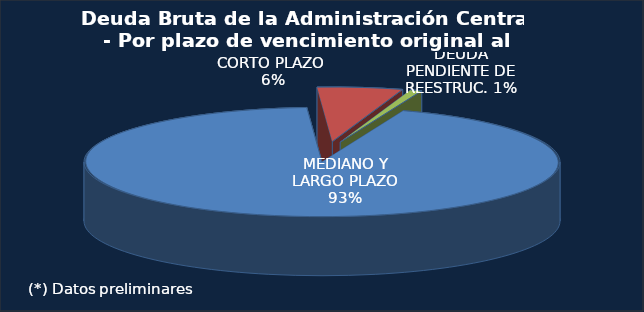
| Category | Series 0 |
|---|---|
| MEDIANO Y LARGO PLAZO | 303042.1 |
| CORTO PLAZO  | 18805.5 |
| DEUDA PENDIENTE DE REESTRUC. | 2526.4 |